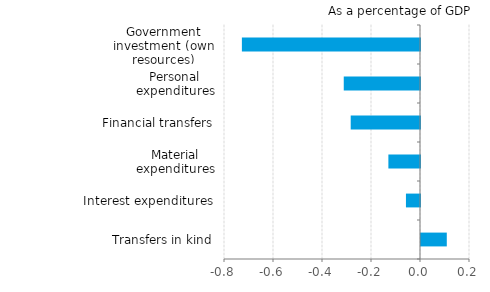
| Category | Series 0 |
|---|---|
| Transfers in kind | 0.105 |
| Interest expenditures | -0.057 |
| Material expenditures | -0.129 |
| Financial transfers | -0.283 |
| Personal expenditures | -0.311 |
| Government investment (own resources) | -0.727 |